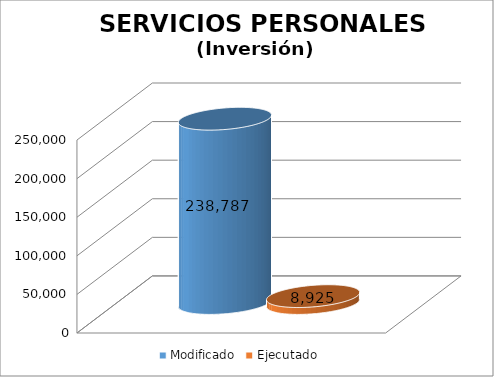
| Category | Modificado | Ejecutado |
|---|---|---|
| 0 | 238787 | 8924.66 |